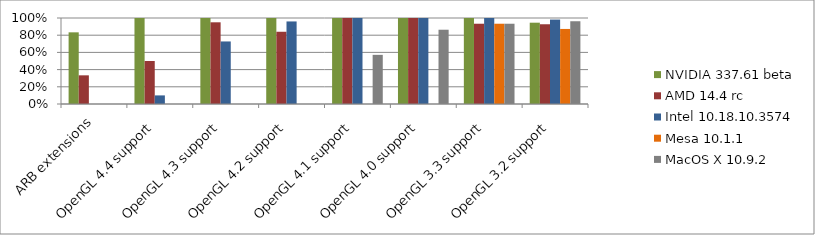
| Category | NVIDIA 337.61 beta | AMD 14.4 rc | Intel 10.18.10.3574 | Mesa 10.1.1 | MacOS X 10.9.2 |
|---|---|---|---|---|---|
| ARB extensions | 0.833 | 0.333 | 0 | 0 | 0 |
| OpenGL 4.4 support | 1 | 0.5 | 0.1 | 0 | 0 |
| OpenGL 4.3 support | 1 | 0.95 | 0.727 | 0 | 0 |
| OpenGL 4.2 support | 1 | 0.84 | 0.96 | 0 | 0 |
| OpenGL 4.1 support | 1 | 1 | 1 | 0 | 0.571 |
| OpenGL 4.0 support | 1 | 1 | 1 | 0 | 0.864 |
| OpenGL 3.3 support | 1 | 0.933 | 1 | 0.933 | 0.933 |
| OpenGL 3.2 support | 0.945 | 0.927 | 0.982 | 0.873 | 0.962 |